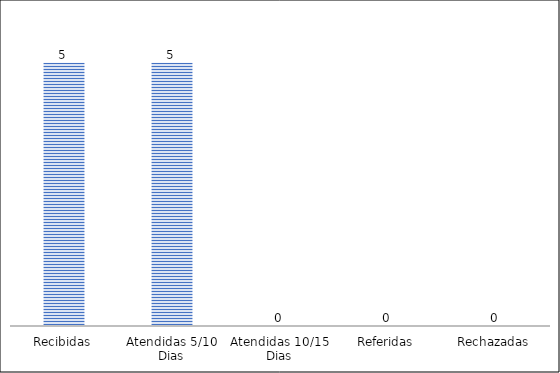
| Category | Series 0 | Series 4 |
|---|---|---|
| Recibidas | 5 |  |
| Atendidas 5/10 Dias | 5 |  |
| Atendidas 10/15 Dias | 0 |  |
| Referidas | 0 |  |
| Rechazadas | 0 |  |